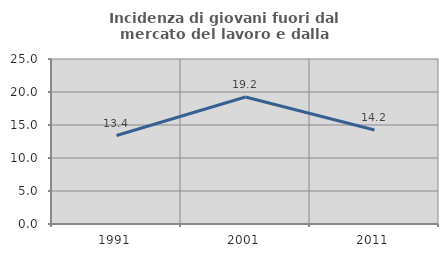
| Category | Incidenza di giovani fuori dal mercato del lavoro e dalla formazione  |
|---|---|
| 1991.0 | 13.402 |
| 2001.0 | 19.244 |
| 2011.0 | 14.234 |